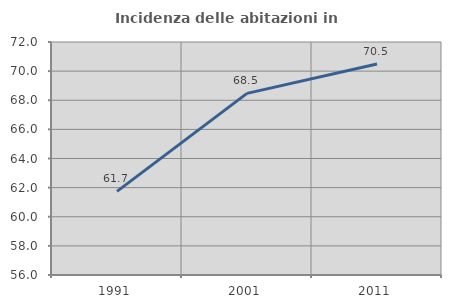
| Category | Incidenza delle abitazioni in proprietà  |
|---|---|
| 1991.0 | 61.744 |
| 2001.0 | 68.474 |
| 2011.0 | 70.484 |